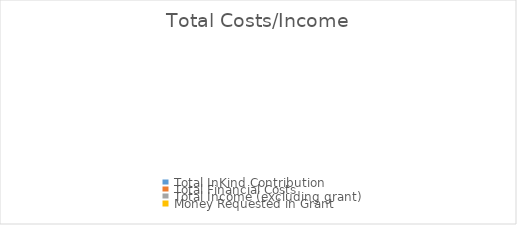
| Category | Total Costs/Income |
|---|---|
| Total InKind Contribution | 0 |
| Total Financial Costs | 0 |
| Total Income (excluding grant) | 0 |
| Money Requested in Grant | 0 |